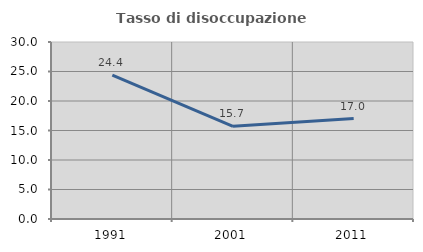
| Category | Tasso di disoccupazione giovanile  |
|---|---|
| 1991.0 | 24.39 |
| 2001.0 | 15.714 |
| 2011.0 | 17.021 |